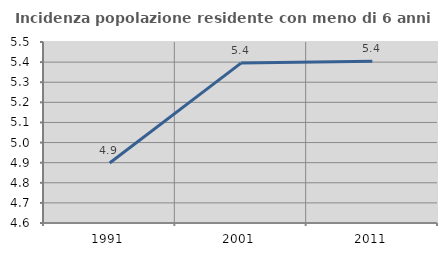
| Category | Incidenza popolazione residente con meno di 6 anni |
|---|---|
| 1991.0 | 4.898 |
| 2001.0 | 5.395 |
| 2011.0 | 5.404 |